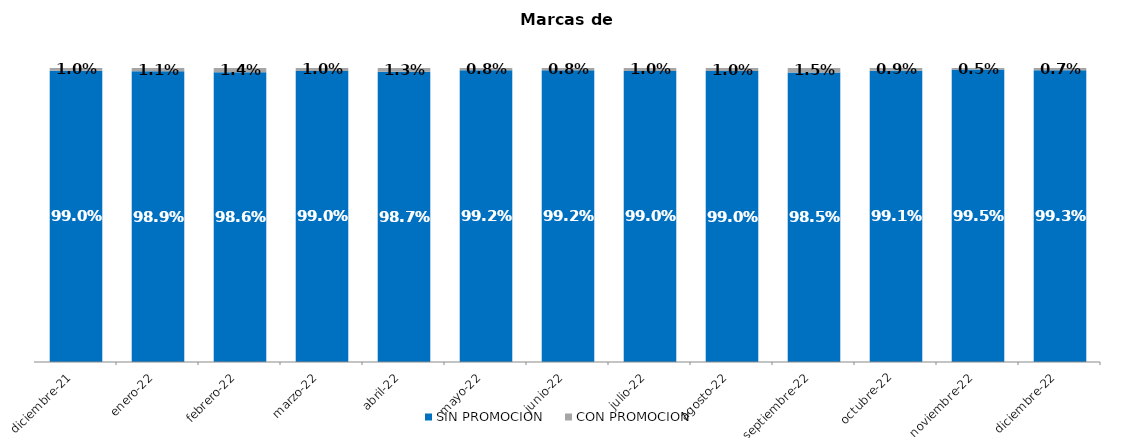
| Category | SIN PROMOCION   | CON PROMOCION   |
|---|---|---|
| 2021-12-01 | 0.99 | 0.01 |
| 2022-01-01 | 0.989 | 0.011 |
| 2022-02-01 | 0.986 | 0.014 |
| 2022-03-01 | 0.99 | 0.01 |
| 2022-04-01 | 0.987 | 0.013 |
| 2022-05-01 | 0.992 | 0.008 |
| 2022-06-01 | 0.992 | 0.008 |
| 2022-07-01 | 0.99 | 0.01 |
| 2022-08-01 | 0.99 | 0.01 |
| 2022-09-01 | 0.985 | 0.015 |
| 2022-10-01 | 0.991 | 0.009 |
| 2022-11-01 | 0.995 | 0.005 |
| 2022-12-01 | 0.993 | 0.007 |